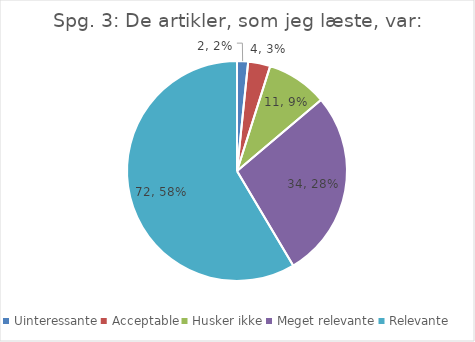
| Category | Svar |
|---|---|
| Uinteressante | 2 |
| Acceptable | 4 |
| Husker ikke | 11 |
| Meget relevante | 34 |
| Relevante | 72 |